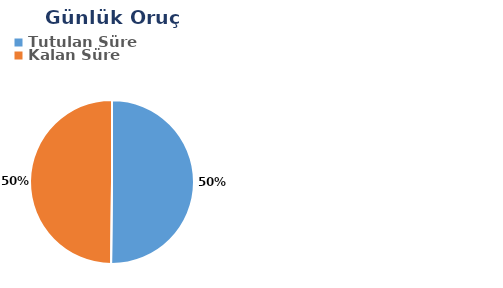
| Category | Günlük |
|---|---|
| Tutulan Süre | 0.292 |
| Kalan Süre | 0.29 |